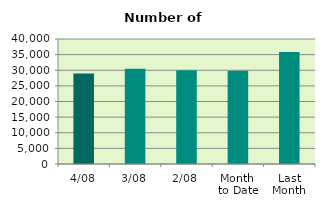
| Category | Series 0 |
|---|---|
| 4/08 | 28976 |
| 3/08 | 30508 |
| 2/08 | 29978 |
| Month 
to Date | 29820.667 |
| Last
Month | 35875.545 |